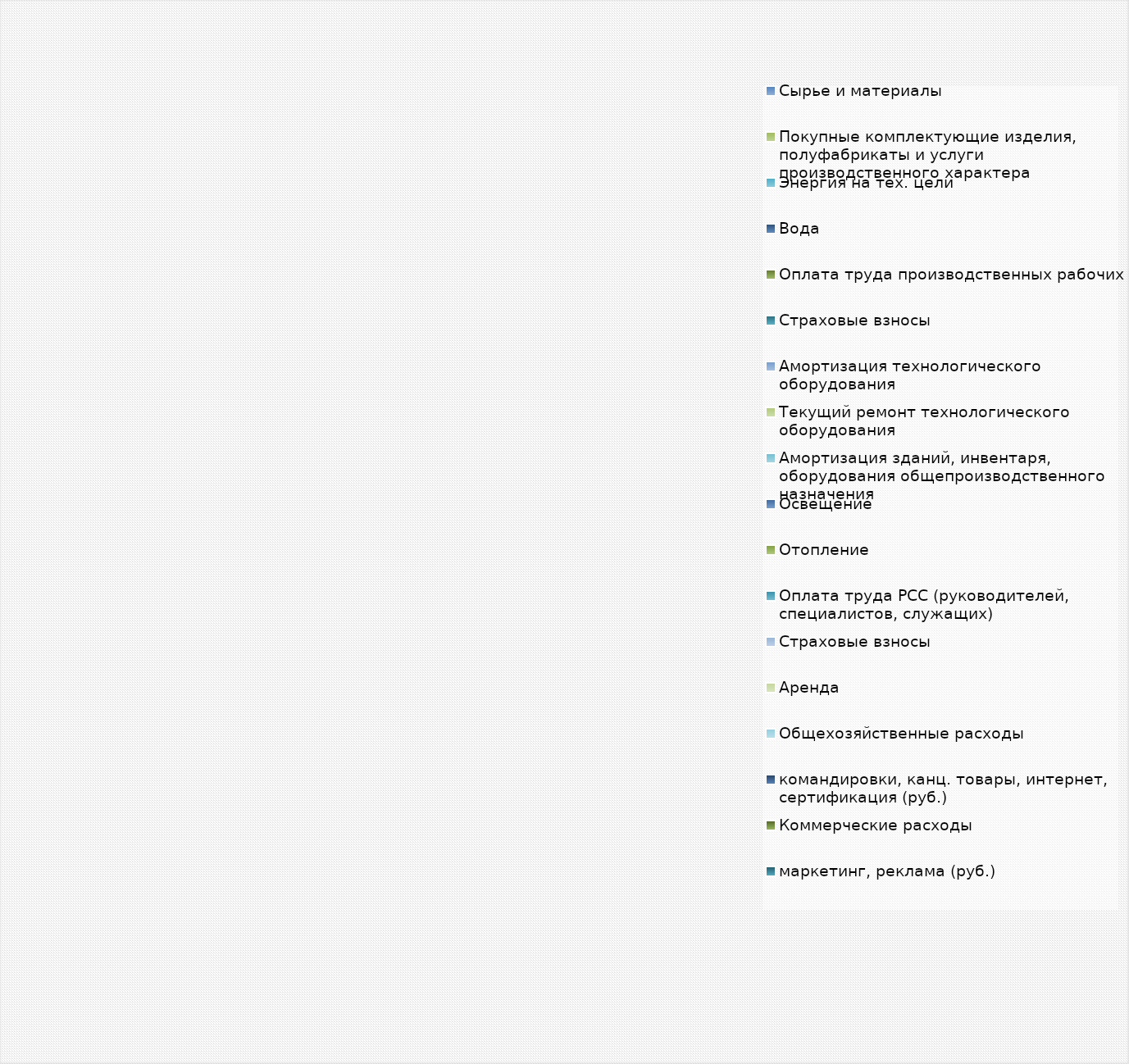
| Category | Series 0 |
|---|---|
| Сырье и материалы | 0 |
| Покупные комплектующие изделия, полуфабрикаты и услуги производственного характера | 0 |
| Энергия на тех. цели | 0 |
| Вода | 0 |
| Оплата труда производственных рабочих | 0 |
| Страховые взносы | 0 |
| Амортизация технологического оборудования | 0 |
| Текущий ремонт технологического оборудования | 0 |
| Амортизация зданий, инвентаря, оборудования общепроизводственного назначения | 0 |
| Освещение | 0 |
| Отопление | 0 |
| Оплата труда РСС (руководителей, специалистов, служащих) | 0 |
| Страховые взносы | 0 |
| Аренда | 0 |
| Общехозяйственные расходы  | 0 |
| командировки, канц. товары, интернет, сертификация (руб.) | 0 |
| Коммерческие расходы  | 0 |
| маркетинг, реклама (руб.) | 0 |